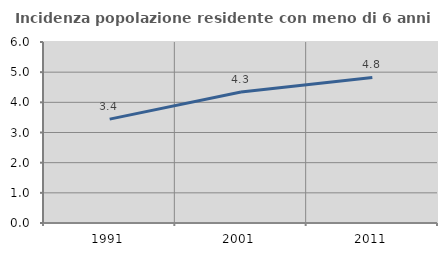
| Category | Incidenza popolazione residente con meno di 6 anni |
|---|---|
| 1991.0 | 3.444 |
| 2001.0 | 4.343 |
| 2011.0 | 4.823 |